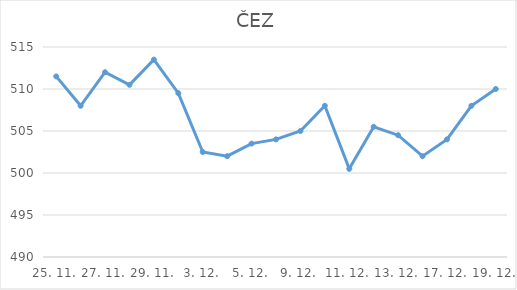
| Category | ČEZ |
|---|---|
| 25. 11. | 511.5 |
| 26. 11. | 508 |
| 27. 11. | 512 |
| 28. 11. | 510.5 |
| 29. 11. | 513.5 |
| 2. 12. | 509.5 |
| 3. 12. | 502.5 |
| 4. 12. | 502 |
| 5. 12. | 503.5 |
| 6. 12. | 504 |
| 9. 12. | 505 |
| 10. 12. | 508 |
| 11. 12. | 500.5 |
| 12. 12. | 505.5 |
| 13. 12. | 504.5 |
| 16. 12. | 502 |
| 17. 12. | 504 |
| 18. 12. | 508 |
| 19. 12. | 510 |